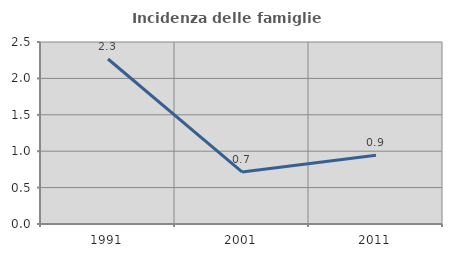
| Category | Incidenza delle famiglie numerose |
|---|---|
| 1991.0 | 2.266 |
| 2001.0 | 0.715 |
| 2011.0 | 0.943 |